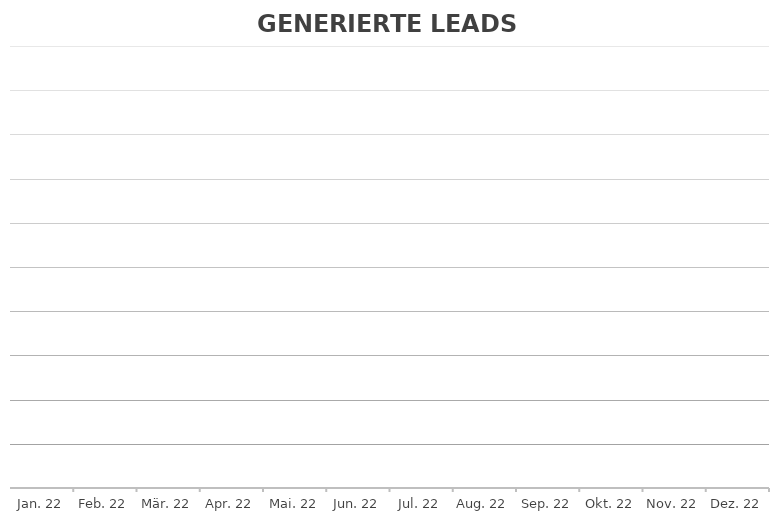
| Category | GESAMT |
|---|---|
| 2022-01-18 | 0 |
| 2022-02-18 | 0 |
| 2022-03-18 | 0 |
| 2022-04-18 | 0 |
| 2022-05-18 | 0 |
| 2022-06-18 | 0 |
| 2022-07-18 | 0 |
| 2022-08-18 | 0 |
| 2022-09-18 | 0 |
| 2022-10-18 | 0 |
| 2022-11-18 | 0 |
| 2022-12-18 | 0 |